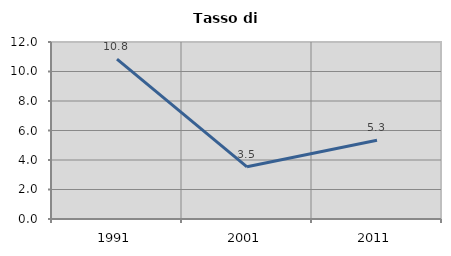
| Category | Tasso di disoccupazione   |
|---|---|
| 1991.0 | 10.841 |
| 2001.0 | 3.54 |
| 2011.0 | 5.345 |